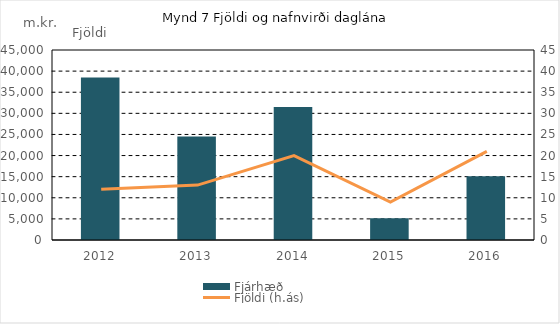
| Category | Fjárhæð |
|---|---|
| 2012.0 | 38509 |
| 2013.0 | 24500 |
| 2014.0 | 31510 |
| 2015.0 | 5180 |
| 2016.0 | 15070.111 |